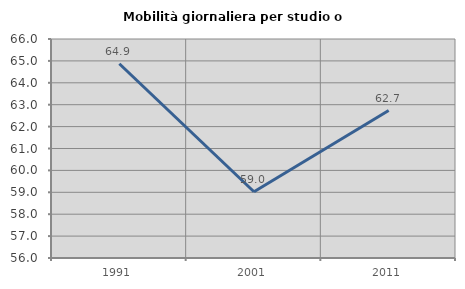
| Category | Mobilità giornaliera per studio o lavoro |
|---|---|
| 1991.0 | 64.87 |
| 2001.0 | 59.024 |
| 2011.0 | 62.734 |